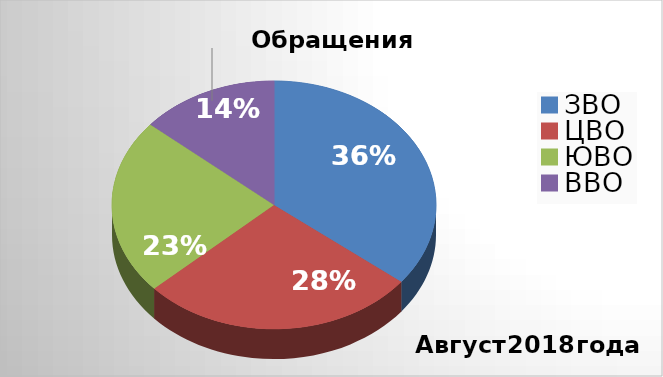
| Category | Series 0 |
|---|---|
| ЗВО | 31 |
| ЦВО | 24 |
| ЮВО | 20 |
| ВВО | 12 |